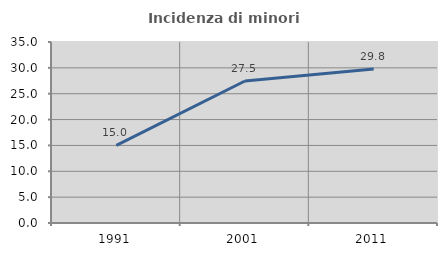
| Category | Incidenza di minori stranieri |
|---|---|
| 1991.0 | 15 |
| 2001.0 | 27.459 |
| 2011.0 | 29.771 |